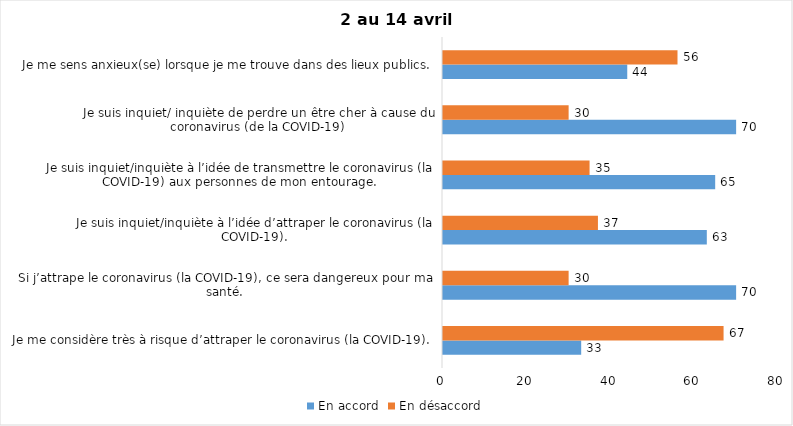
| Category | En accord | En désaccord |
|---|---|---|
| Je me considère très à risque d’attraper le coronavirus (la COVID-19). | 33 | 67 |
| Si j’attrape le coronavirus (la COVID-19), ce sera dangereux pour ma santé. | 70 | 30 |
| Je suis inquiet/inquiète à l’idée d’attraper le coronavirus (la COVID-19). | 63 | 37 |
| Je suis inquiet/inquiète à l’idée de transmettre le coronavirus (la COVID-19) aux personnes de mon entourage. | 65 | 35 |
| Je suis inquiet/ inquiète de perdre un être cher à cause du coronavirus (de la COVID-19) | 70 | 30 |
| Je me sens anxieux(se) lorsque je me trouve dans des lieux publics. | 44 | 56 |